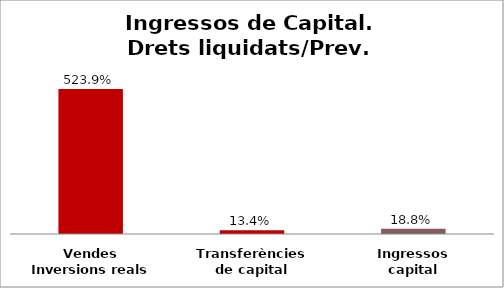
| Category | Series 0 |
|---|---|
| Vendes Inversions reals | 5.239 |
| Transferències de capital | 0.134 |
| Ingressos capital | 0.188 |